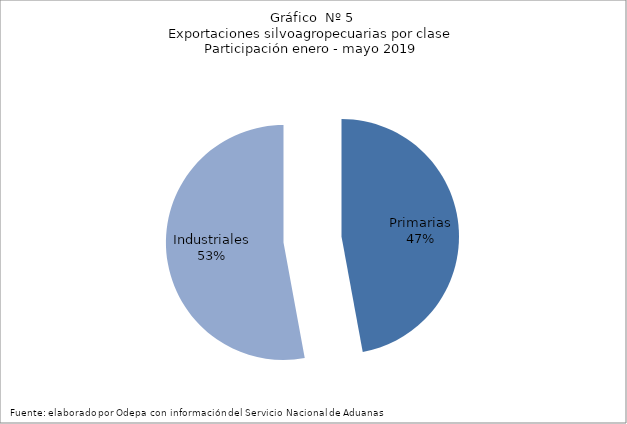
| Category | Series 0 |
|---|---|
| Primarias | 3753129 |
| Industriales | 4214043 |